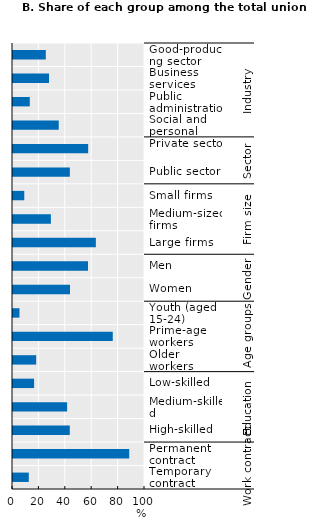
| Category | OECD average |
|---|---|
| 0 | 11.962 |
| 1 | 88.038 |
| 2 | 43.026 |
| 3 | 40.995 |
| 4 | 15.979 |
| 5 | 17.55 |
| 6 | 75.583 |
| 7 | 4.898 |
| 8 | 43.189 |
| 9 | 56.811 |
| 10 | 62.76 |
| 11 | 28.7 |
| 12 | 8.54 |
| 13 | 43.058 |
| 14 | 56.942 |
| 15 | 34.648 |
| 16 | 12.704 |
| 17 | 27.296 |
| 18 | 24.842 |